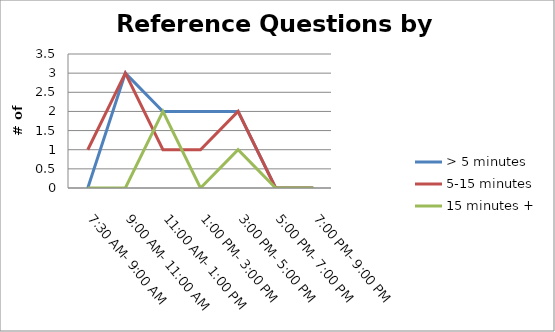
| Category | > 5 minutes | 5-15 minutes | 15 minutes + |
|---|---|---|---|
| 7:30 AM- 9:00 AM | 0 | 1 | 0 |
| 9:00 AM- 11:00 AM | 3 | 3 | 0 |
| 11:00 AM- 1:00 PM | 2 | 1 | 2 |
| 1:00 PM- 3:00 PM | 2 | 1 | 0 |
| 3:00 PM- 5:00 PM | 2 | 2 | 1 |
| 5:00 PM- 7:00 PM | 0 | 0 | 0 |
| 7:00 PM- 9:00 PM | 0 | 0 | 0 |